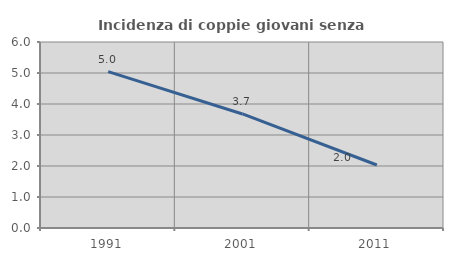
| Category | Incidenza di coppie giovani senza figli |
|---|---|
| 1991.0 | 5.045 |
| 2001.0 | 3.679 |
| 2011.0 | 2.033 |